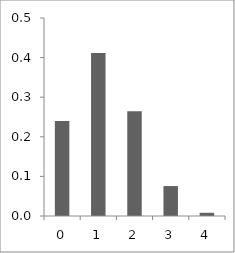
| Category | Series 0 |
|---|---|
| 0.0 | 0.24 |
| 1.0 | 0.412 |
| 2.0 | 0.265 |
| 3.0 | 0.076 |
| 4.0 | 0.008 |